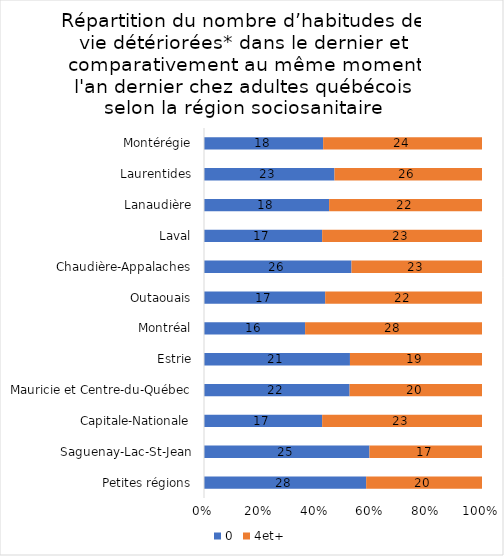
| Category | 0 | 4et+ |
|---|---|---|
| Petites régions | 28 | 20 |
| Saguenay-Lac-St-Jean | 25 | 17 |
| Capitale-Nationale | 17 | 23 |
| Mauricie et Centre-du-Québec | 22 | 20 |
| Estrie | 21 | 19 |
| Montréal | 16 | 28 |
| Outaouais | 17 | 22 |
| Chaudière-Appalaches | 26 | 23 |
| Laval | 17 | 23 |
| Lanaudière | 18 | 22 |
| Laurentides | 23 | 26 |
| Montérégie | 18 | 24 |